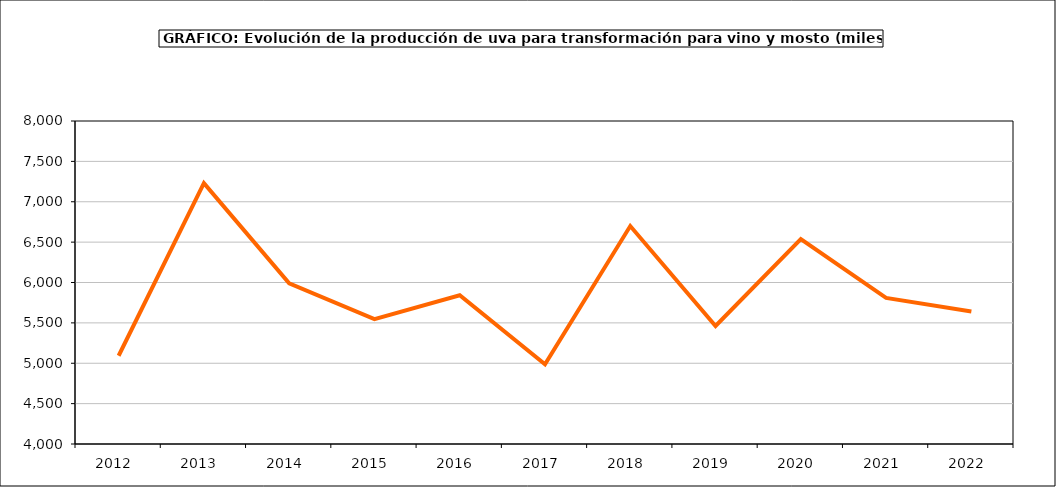
| Category | producción |
|---|---|
| 2012.0 | 5092.752 |
| 2013.0 | 7230.832 |
| 2014.0 | 5989.046 |
| 2015.0 | 5547.235 |
| 2016.0 | 5842.604 |
| 2017.0 | 4987.215 |
| 2018.0 | 6699.512 |
| 2019.0 | 5461.92 |
| 2020.0 | 6538.914 |
| 2021.0 | 5809.326 |
| 2022.0 | 5641.681 |